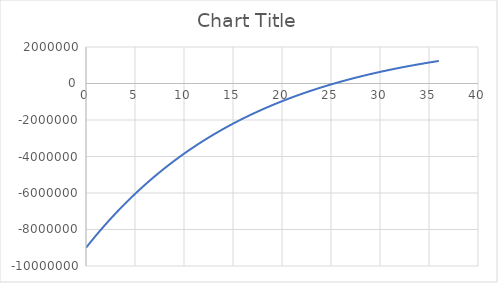
| Category | Series 0 |
|---|---|
| 0.0 | -9000000 |
| 1.0 | -8339622.642 |
| 2.0 | -7716625.133 |
| 3.0 | -7128891.635 |
| 4.0 | -6574426.071 |
| 5.0 | -6051345.35 |
| 6.0 | -5557872.972 |
| 7.0 | -5092332.992 |
| 8.0 | -4653144.332 |
| 9.0 | -4238815.408 |
| 10.0 | -3847939.064 |
| 11.0 | -3479187.796 |
| 12.0 | -3131309.242 |
| 13.0 | -2803121.926 |
| 14.0 | -2493511.251 |
| 15.0 | -2201425.709 |
| 16.0 | -1925873.31 |
| 17.0 | -1665918.217 |
| 18.0 | -1420677.563 |
| 19.0 | -1189318.456 |
| 20.0 | -971055.147 |
| 21.0 | -765146.365 |
| 22.0 | -570892.797 |
| 23.0 | -387634.714 |
| 24.0 | -214749.731 |
| 25.0 | -51650.689 |
| 26.0 | 102216.331 |
| 27.0 | 247373.897 |
| 28.0 | 384314.997 |
| 29.0 | 513504.714 |
| 30.0 | 635381.806 |
| 31.0 | 750360.194 |
| 32.0 | 858830.372 |
| 33.0 | 961160.728 |
| 34.0 | 1057698.8 |
| 35.0 | 1148772.453 |
| 36.0 | 1234690.994 |